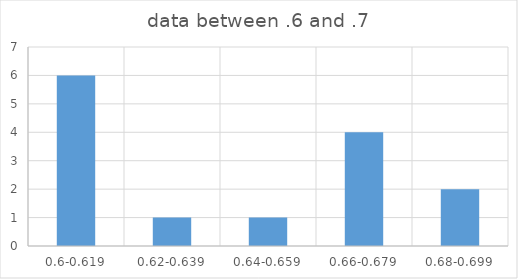
| Category | Series 0 |
|---|---|
| 0.6-0.619 | 6 |
| 0.62-0.639 | 1 |
| 0.64-0.659 | 1 |
| 0.66-0.679 | 4 |
| 0.68-0.699 | 2 |